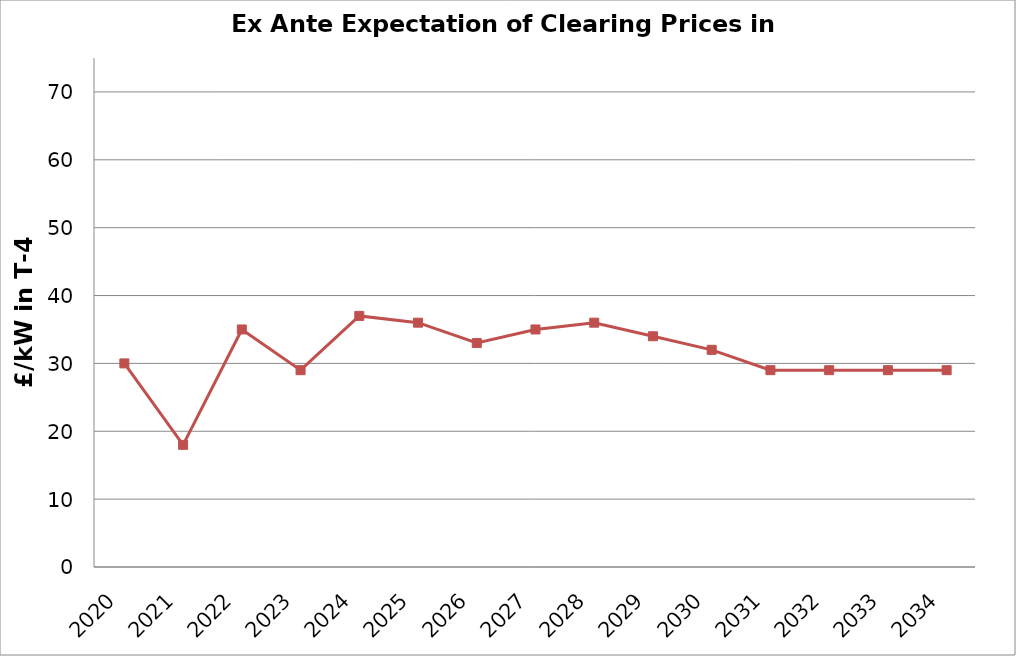
| Category | x |
|---|---|
| 2020.0 | 30 |
| 2021.0 | 18 |
| 2022.0 | 35 |
| 2023.0 | 29 |
| 2024.0 | 37 |
| 2025.0 | 36 |
| 2026.0 | 33 |
| 2027.0 | 35 |
| 2028.0 | 36 |
| 2029.0 | 34 |
| 2030.0 | 32 |
| 2031.0 | 29 |
| 2032.0 | 29 |
| 2033.0 | 29 |
| 2034.0 | 29 |